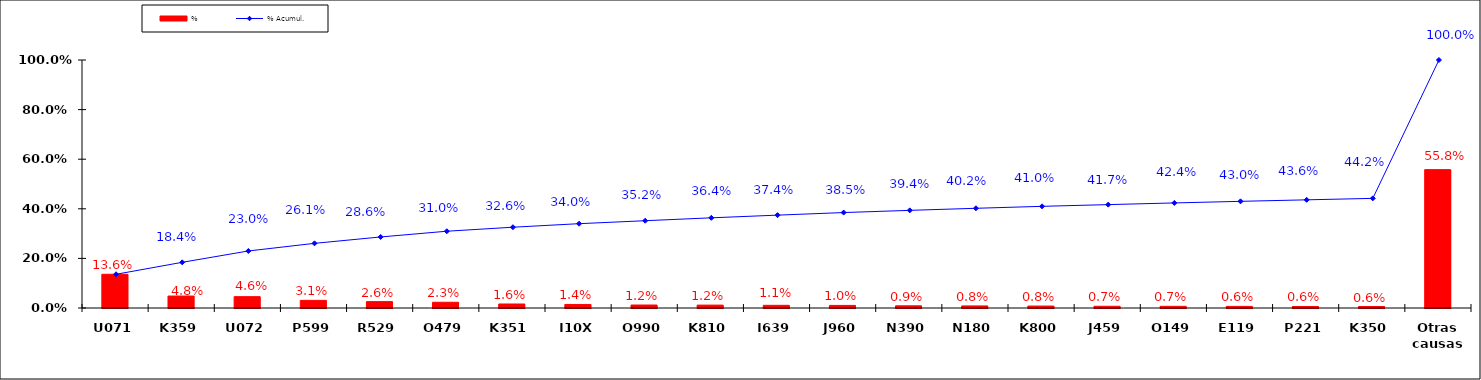
| Category | % |
|---|---|
| U071 | 0.136 |
| K359 | 0.048 |
| U072 | 0.046 |
| P599 | 0.031 |
| R529 | 0.026 |
| O479 | 0.023 |
| K351 | 0.016 |
| I10X | 0.014 |
| O990 | 0.012 |
| K810 | 0.012 |
| I639 | 0.011 |
| J960 | 0.01 |
| N390 | 0.009 |
| N180 | 0.008 |
| K800 | 0.008 |
| J459 | 0.007 |
| O149 | 0.007 |
| E119 | 0.006 |
| P221 | 0.006 |
| K350 | 0.006 |
| Otras causas | 0.558 |